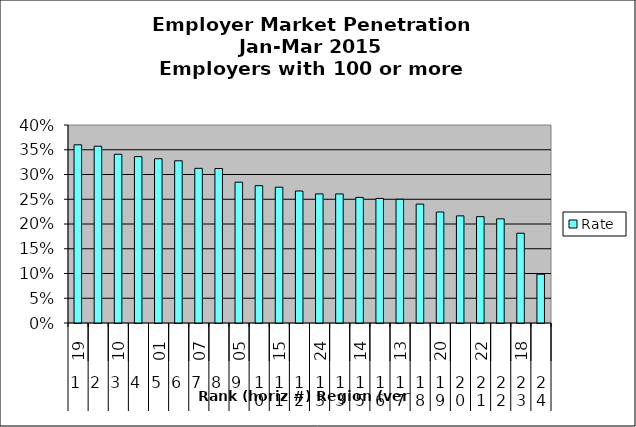
| Category | Rate |
|---|---|
| 0 | 0.36 |
| 1 | 0.357 |
| 2 | 0.341 |
| 3 | 0.336 |
| 4 | 0.332 |
| 5 | 0.328 |
| 6 | 0.312 |
| 7 | 0.312 |
| 8 | 0.285 |
| 9 | 0.277 |
| 10 | 0.274 |
| 11 | 0.267 |
| 12 | 0.261 |
| 13 | 0.261 |
| 14 | 0.254 |
| 15 | 0.252 |
| 16 | 0.25 |
| 17 | 0.24 |
| 18 | 0.224 |
| 19 | 0.216 |
| 20 | 0.215 |
| 21 | 0.21 |
| 22 | 0.181 |
| 23 | 0.099 |